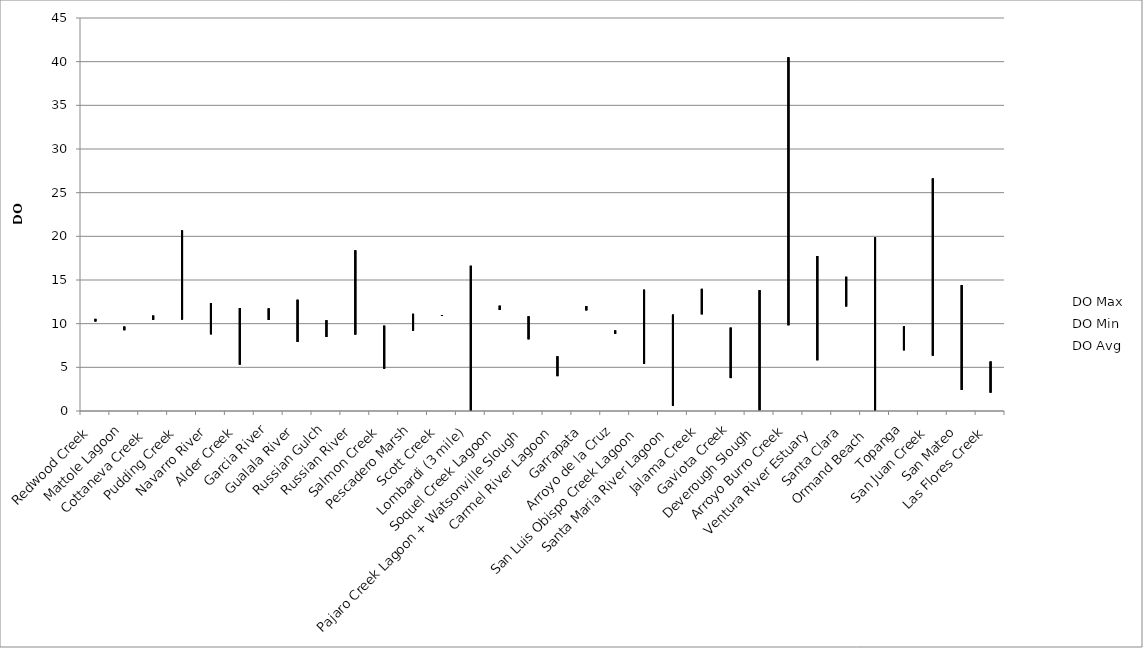
| Category | DO Max | DO Min | DO Avg |
|---|---|---|---|
| Redwood Creek  | 10.55 | 10.25 | 10.445 |
| Mattole Lagoon | 9.67 | 9.25 | 9.47 |
| Cottaneva Creek  | 10.93 | 10.44 | 10.647 |
| Pudding Creek | 20.68 | 10.47 | 14.829 |
| Navarro River | 12.36 | 8.78 | 9.984 |
| Alder Creek | 11.79 | 5.31 | 10.605 |
| Garcia River | 11.75 | 10.43 | 10.971 |
| Gualala River | 12.74 | 7.91 | 9.656 |
| Russian Gulch | 10.4 | 8.48 | 9.502 |
| Russian River | 18.4 | 8.75 | 10.821 |
| Salmon Creek | 9.77 | 4.84 | 8.056 |
| Pescadero Marsh | 11.13 | 9.2 | 10.109 |
| Scott Creek | 10.98 | 10.89 | 10.922 |
| Lombardi (3 mile) | 16.63 | 0.03 | 7.637 |
| Soquel Creek Lagoon | 12.06 | 11.57 | 11.736 |
| Pajaro Creek Lagoon + Watsonville Slough | 10.85 | 8.21 | 9.466 |
| Carmel River Lagoon | 6.27 | 3.99 | 5.384 |
| Garrapata | 12.01 | 11.52 | 11.648 |
| Arroyo de la Cruz | 9.23 | 8.84 | 9.02 |
| San Luis Obispo Creek Lagoon | 13.89 | 5.38 | 9.32 |
| Santa Maria River Lagoon | 11.04 | 0.61 | 8.006 |
| Jalama Creek | 13.99 | 11.07 | 12.315 |
| Gaviota Creek | 9.55 | 3.77 | 7.417 |
| Deverough Slough | 13.84 | 0.08 | 8.683 |
| Arroyo Burro Creek | 40.52 | 9.81 | 19.016 |
| Ventura River Estuary | 17.75 | 5.81 | 10.776 |
| Santa Clara | 15.37 | 11.97 | 13.806 |
| Ormand Beach  | 19.88 | 0.04 | 10.341 |
| Topanga | 9.69 | 6.95 | 8.835 |
| San Juan Creek | 26.63 | 6.34 | 15.514 |
| San Mateo | 14.42 | 2.41 | 9.96 |
| Las Flores Creek | 5.67 | 2.1 | 4.533 |